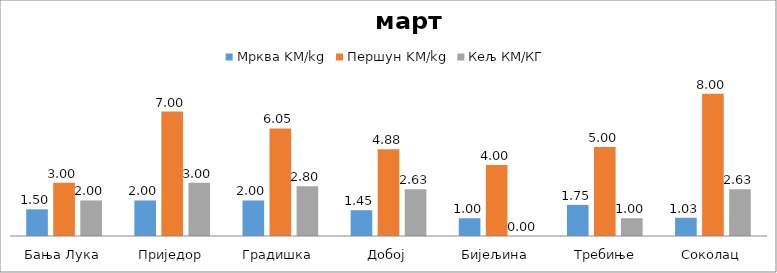
| Category | Мрква KM/kg | Першун KM/kg | Кељ КМ/КГ |
|---|---|---|---|
| Бања Лука | 1.5 | 3 | 2 |
| Приједор | 2 | 7 | 3 |
| Градишка | 2 | 6.05 | 2.8 |
| Добој | 1.45 | 4.875 | 2.625 |
| Бијељина | 1 | 4 | 0 |
|  Требиње | 1.75 | 5 | 1 |
| Соколац | 1.025 | 8 | 2.625 |